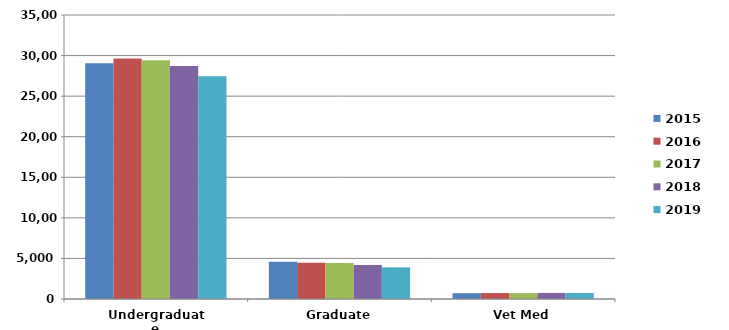
| Category | 2015 | 2016 | 2017 | 2018 | 2019 |
|---|---|---|---|---|---|
| Undergraduate | 29053 | 29626 | 29422 | 28706 | 27444 |
| Graduate | 4577 | 4474 | 4428 | 4179 | 3896 |
| Vet Med | 717 | 730 | 723 | 749 | 737 |